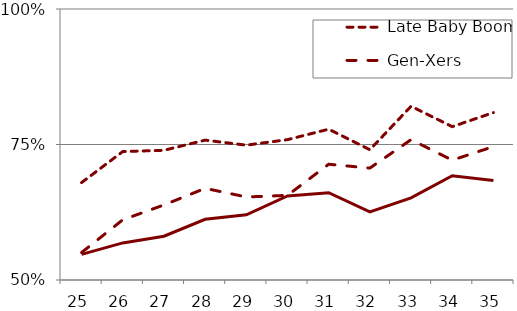
| Category | Late Baby Boomers | Gen-Xers | Millennials |
|---|---|---|---|
| 25.0 | 0.68 | 0.551 | 0.547 |
| 26.0 | 0.737 | 0.611 | 0.568 |
| 27.0 | 0.739 | 0.638 | 0.581 |
| 28.0 | 0.758 | 0.669 | 0.612 |
| 29.0 | 0.749 | 0.653 | 0.62 |
| 30.0 | 0.759 | 0.656 | 0.655 |
| 31.0 | 0.778 | 0.714 | 0.661 |
| 32.0 | 0.74 | 0.706 | 0.626 |
| 33.0 | 0.821 | 0.759 | 0.652 |
| 34.0 | 0.783 | 0.721 | 0.692 |
| 35.0 | 0.809 | 0.746 | 0.683 |